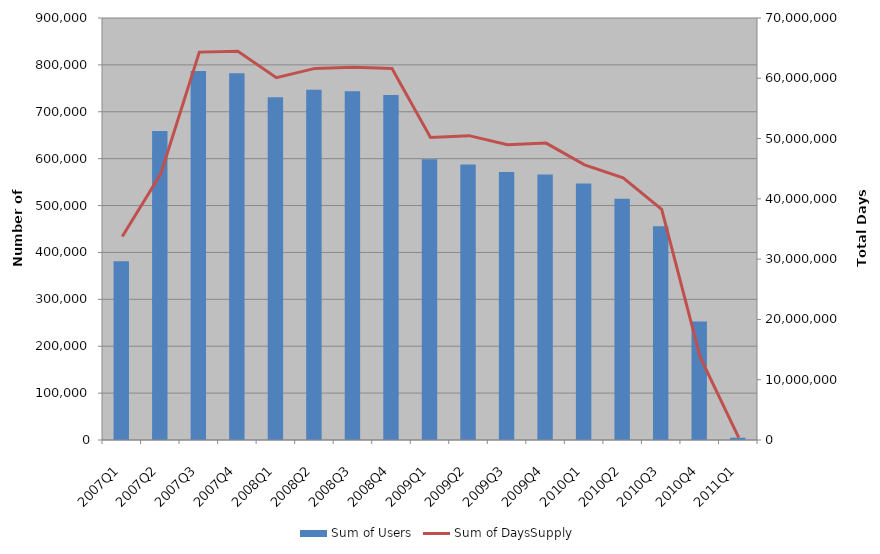
| Category | Sum of Users |
|---|---|
| 2007Q1 | 381349 |
| 2007Q2 | 658771 |
| 2007Q3 | 786961 |
| 2007Q4 | 782282 |
| 2008Q1 | 730796 |
| 2008Q2 | 746899 |
| 2008Q3 | 743712 |
| 2008Q4 | 735693 |
| 2009Q1 | 598979 |
| 2009Q2 | 587351 |
| 2009Q3 | 571812 |
| 2009Q4 | 566457 |
| 2010Q1 | 547273 |
| 2010Q2 | 514350 |
| 2010Q3 | 455792 |
| 2010Q4 | 252689 |
| 2011Q1 | 4909 |